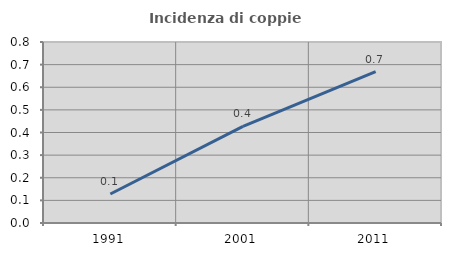
| Category | Incidenza di coppie miste |
|---|---|
| 1991.0 | 0.128 |
| 2001.0 | 0.427 |
| 2011.0 | 0.669 |